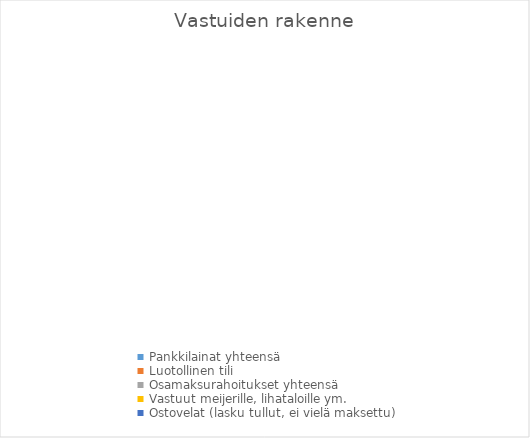
| Category | Series 0 |
|---|---|
| Pankkilainat yhteensä | 0 |
| Luotollinen tili | 0 |
| Osamaksurahoitukset yhteensä | 0 |
| Vastuut meijerille, lihataloille ym. | 0 |
| Ostovelat (lasku tullut, ei vielä maksettu) | 0 |